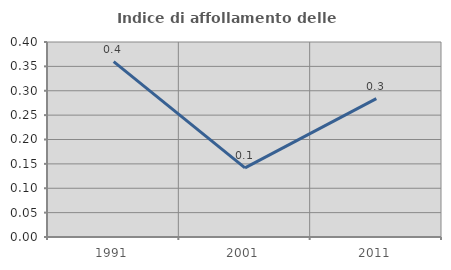
| Category | Indice di affollamento delle abitazioni  |
|---|---|
| 1991.0 | 0.36 |
| 2001.0 | 0.142 |
| 2011.0 | 0.284 |